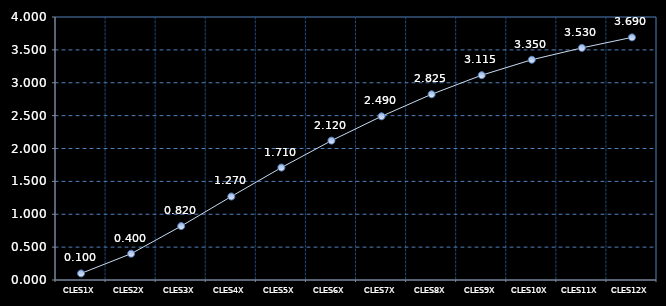
| Category | Series 0 |
|---|---|
| CLES1X | 0.1 |
| CLES2X | 0.4 |
| CLES3X | 0.82 |
| CLES4X | 1.27 |
| CLES5X | 1.71 |
| CLES6X | 2.12 |
| CLES7X | 2.49 |
| CLES8X | 2.825 |
| CLES9X | 3.115 |
| CLES10X | 3.35 |
| CLES11X | 3.53 |
| CLES12X | 3.69 |